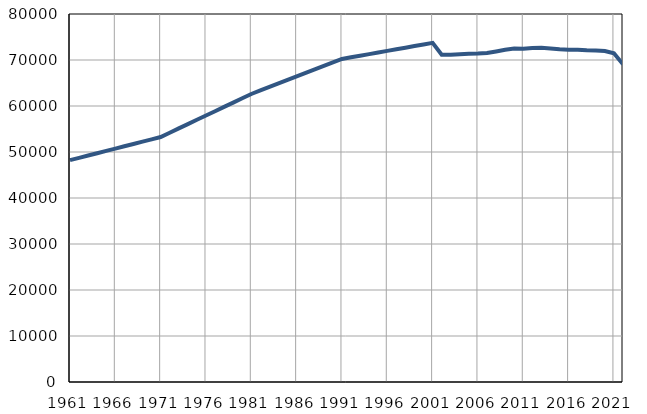
| Category | Број
становника |
|---|---|
| 1961.0 | 48228 |
| 1962.0 | 48731 |
| 1963.0 | 49234 |
| 1964.0 | 49738 |
| 1965.0 | 50241 |
| 1966.0 | 50744 |
| 1967.0 | 51247 |
| 1968.0 | 51750 |
| 1969.0 | 52254 |
| 1970.0 | 52757 |
| 1971.0 | 53260 |
| 1972.0 | 54195 |
| 1973.0 | 55130 |
| 1974.0 | 56066 |
| 1975.0 | 57001 |
| 1976.0 | 57936 |
| 1977.0 | 58871 |
| 1978.0 | 59806 |
| 1979.0 | 60742 |
| 1980.0 | 61677 |
| 1981.0 | 62612 |
| 1982.0 | 63374 |
| 1983.0 | 64136 |
| 1984.0 | 64899 |
| 1985.0 | 65661 |
| 1986.0 | 66422 |
| 1987.0 | 67185 |
| 1988.0 | 67947 |
| 1989.0 | 68710 |
| 1990.0 | 69472 |
| 1991.0 | 70234 |
| 1992.0 | 70585 |
| 1993.0 | 70934 |
| 1994.0 | 71283 |
| 1995.0 | 71633 |
| 1996.0 | 71983 |
| 1997.0 | 72333 |
| 1998.0 | 72683 |
| 1999.0 | 73033 |
| 2000.0 | 73382 |
| 2001.0 | 73732 |
| 2002.0 | 71135 |
| 2003.0 | 71158 |
| 2004.0 | 71236 |
| 2005.0 | 71340 |
| 2006.0 | 71388 |
| 2007.0 | 71521 |
| 2008.0 | 71862 |
| 2009.0 | 72218 |
| 2010.0 | 72493 |
| 2011.0 | 72459 |
| 2012.0 | 72621 |
| 2013.0 | 72682 |
| 2014.0 | 72522 |
| 2015.0 | 72323 |
| 2016.0 | 72246 |
| 2017.0 | 72209 |
| 2018.0 | 72124 |
| 2019.0 | 72085 |
| 2020.0 | 71953 |
| 2021.0 | 71460 |
| 2022.0 | 69079 |